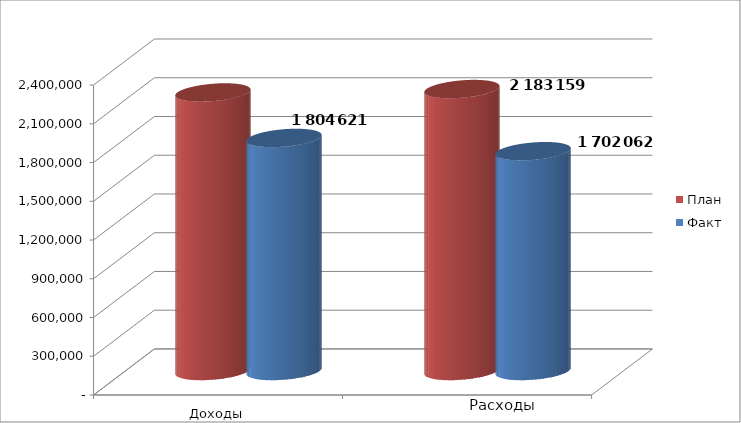
| Category | План | Факт |
|---|---|---|
| 0 | 2156754 | 1804621 |
| 1 | 2183159 | 1702062.25 |